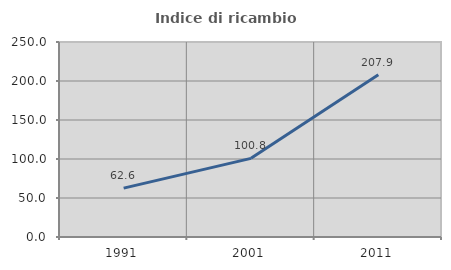
| Category | Indice di ricambio occupazionale  |
|---|---|
| 1991.0 | 62.623 |
| 2001.0 | 100.813 |
| 2011.0 | 207.895 |